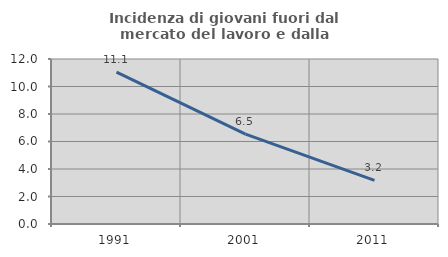
| Category | Incidenza di giovani fuori dal mercato del lavoro e dalla formazione  |
|---|---|
| 1991.0 | 11.052 |
| 2001.0 | 6.536 |
| 2011.0 | 3.175 |